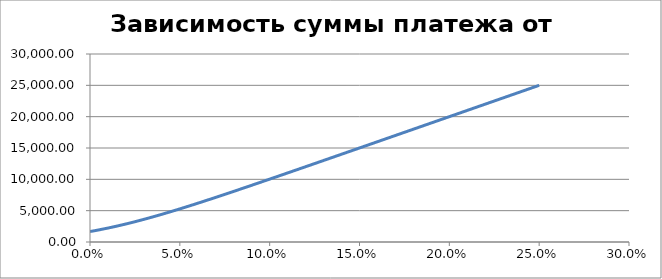
| Category | Платеж |
|---|---|
| 0.0 | 1666.667 |
| 0.005 | 1933.28 |
| 0.01 | 2224.445 |
| 0.015 | 2539.343 |
| 0.02 | 2876.797 |
| 0.025 | 3235.34 |
| 0.030000000000000002 | 3613.296 |
| 0.035 | 4008.862 |
| 0.04 | 4420.185 |
| 0.045 | 4845.426 |
| 0.049999999999999996 | 5282.818 |
| 0.05499999999999999 | 5730.707 |
| 0.05999999999999999 | 6187.572 |
| 0.06499999999999999 | 6652.047 |
| 0.06999999999999999 | 7122.923 |
| 0.075 | 7599.142 |
| 0.08 | 8079.795 |
| 0.085 | 8564.106 |
| 0.09000000000000001 | 9051.419 |
| 0.09500000000000001 | 9541.187 |
| 0.10000000000000002 | 10032.951 |
| 0.10500000000000002 | 10526.335 |
| 0.11000000000000003 | 11021.03 |
| 0.11500000000000003 | 11516.782 |
| 0.12000000000000004 | 12013.384 |
| 0.12500000000000003 | 12510.669 |
| 0.13000000000000003 | 13008.502 |
| 0.13500000000000004 | 13506.773 |
| 0.14000000000000004 | 14005.395 |
| 0.14500000000000005 | 14504.297 |
| 0.15000000000000005 | 15003.422 |
| 0.15500000000000005 | 15502.726 |
| 0.16000000000000006 | 16002.171 |
| 0.16500000000000006 | 16501.73 |
| 0.17000000000000007 | 17001.378 |
| 0.17500000000000007 | 17501.098 |
| 0.18000000000000008 | 18000.876 |
| 0.18500000000000008 | 18500.698 |
| 0.19000000000000009 | 19000.557 |
| 0.1950000000000001 | 19500.445 |
| 0.2000000000000001 | 20000.355 |
| 0.2050000000000001 | 20500.283 |
| 0.2100000000000001 | 21000.227 |
| 0.2150000000000001 | 21500.181 |
| 0.2200000000000001 | 22000.145 |
| 0.22500000000000012 | 22500.116 |
| 0.23000000000000012 | 23000.093 |
| 0.23500000000000013 | 23500.074 |
| 0.24000000000000013 | 24000.06 |
| 0.24500000000000013 | 24500.048 |
| 0.2500000000000001 | 25000.038 |